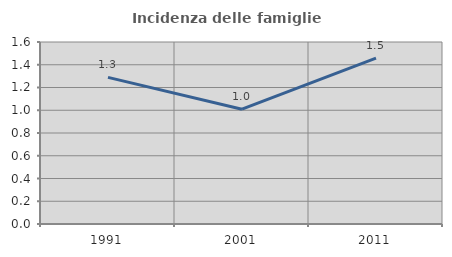
| Category | Incidenza delle famiglie numerose |
|---|---|
| 1991.0 | 1.289 |
| 2001.0 | 1.009 |
| 2011.0 | 1.459 |